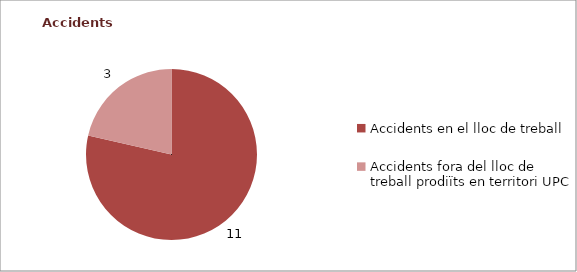
| Category | Series 0 |
|---|---|
| Accidents en el lloc de treball | 11 |
| Accidents fora del lloc de treball prodiïts en territori UPC | 3 |